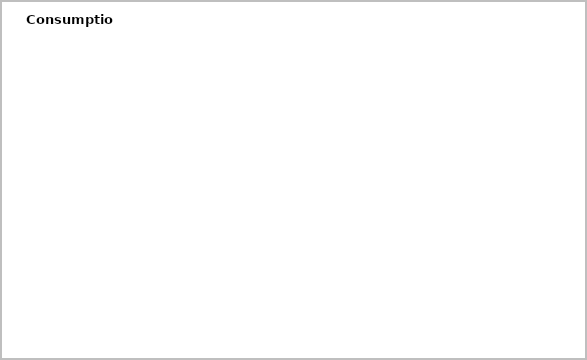
| Category | Consumption | GHG emissions (kg CO2e) |
|---|---|---|
| Electricity, Office |  | 0 |
| Electricity, server room |  | 0 |
| Electricity, XX building |  | 0 |
| Electricity, kitchen |  | 0 |
| Electricity, library |  | 0 |
| Electricity, outside |  | 0 |